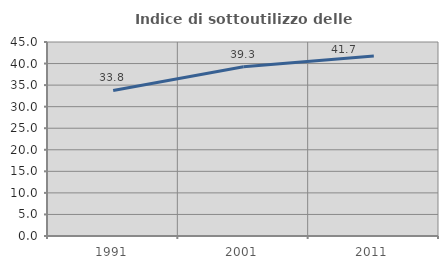
| Category | Indice di sottoutilizzo delle abitazioni  |
|---|---|
| 1991.0 | 33.752 |
| 2001.0 | 39.252 |
| 2011.0 | 41.733 |